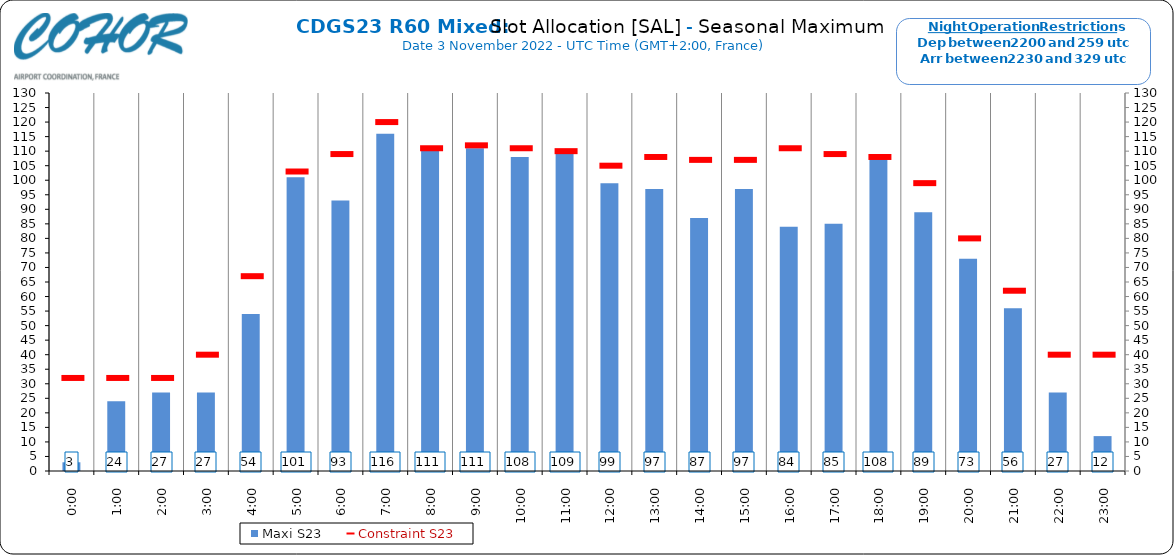
| Category | Maxi S23 |
|---|---|
| 0:00 | 3 |
| 1:00 | 24 |
| 2:00 | 27 |
| 3:00 | 27 |
| 4:00 | 54 |
| 5:00 | 101 |
| 6:00 | 93 |
| 7:00 | 116 |
| 8:00 | 111 |
| 9:00 | 111 |
| 10:00 | 108 |
| 11:00 | 109 |
| 12:00 | 99 |
| 13:00 | 97 |
| 14:00 | 87 |
| 15:00 | 97 |
| 16:00 | 84 |
| 17:00 | 85 |
| 18:00 | 108 |
| 19:00 | 89 |
| 20:00 | 73 |
| 21:00 | 56 |
| 22:00 | 27 |
| 23:00 | 12 |